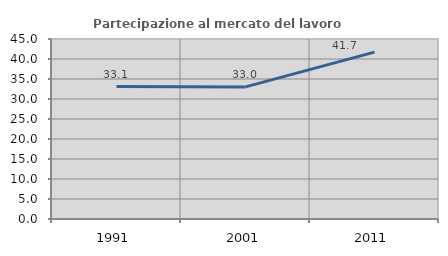
| Category | Partecipazione al mercato del lavoro  femminile |
|---|---|
| 1991.0 | 33.114 |
| 2001.0 | 33.021 |
| 2011.0 | 41.71 |